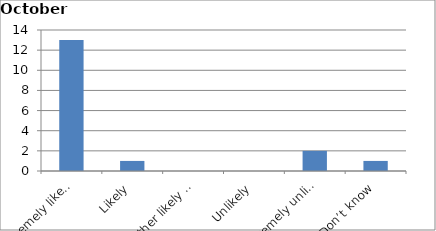
| Category | Series 0 |
|---|---|
| Extremely likely | 13 |
| Likely | 1 |
| Neither likely nor unlikely | 0 |
| Unlikely | 0 |
| Extremely unlikely | 2 |
| Don’t know | 1 |